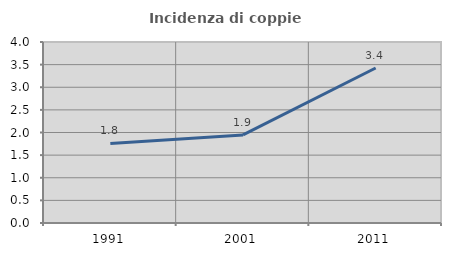
| Category | Incidenza di coppie miste |
|---|---|
| 1991.0 | 1.76 |
| 2001.0 | 1.946 |
| 2011.0 | 3.425 |